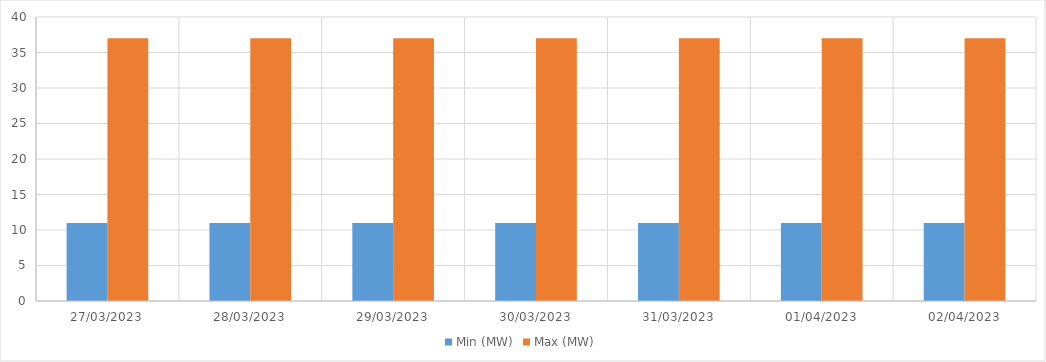
| Category | Min (MW) | Max (MW) |
|---|---|---|
| 27/03/2023 | 11 | 37 |
| 28/03/2023 | 11 | 37 |
| 29/03/2023 | 11 | 37 |
| 30/03/2023 | 11 | 37 |
| 31/03/2023 | 11 | 37 |
| 01/04/2023 | 11 | 37 |
| 02/04/2023 | 11 | 37 |